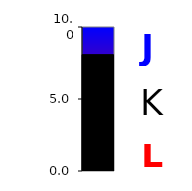
| Category | Series 0 |
|---|---|
| 0 | 8.081 |